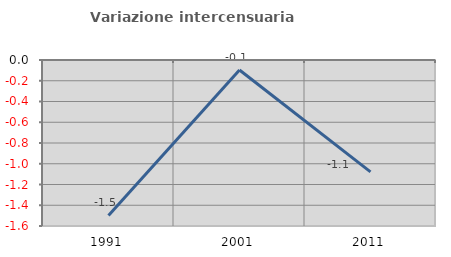
| Category | Variazione intercensuaria annua |
|---|---|
| 1991.0 | -1.499 |
| 2001.0 | -0.096 |
| 2011.0 | -1.078 |